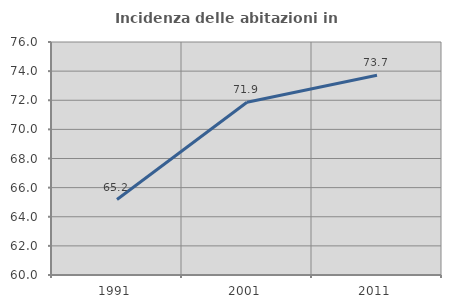
| Category | Incidenza delle abitazioni in proprietà  |
|---|---|
| 1991.0 | 65.18 |
| 2001.0 | 71.863 |
| 2011.0 | 73.715 |